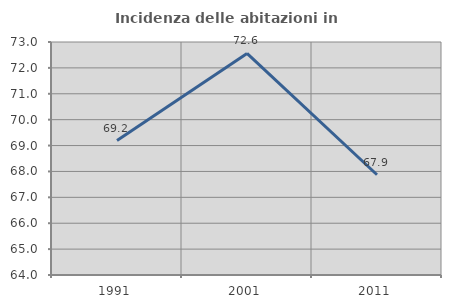
| Category | Incidenza delle abitazioni in proprietà  |
|---|---|
| 1991.0 | 69.192 |
| 2001.0 | 72.558 |
| 2011.0 | 67.873 |